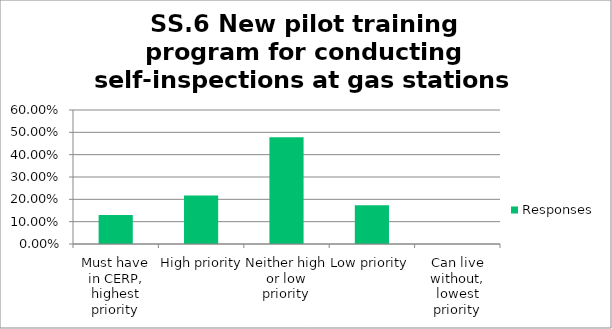
| Category | Responses |
|---|---|
| Must have in CERP, highest priority | 0.13 |
| High priority | 0.217 |
| Neither high or low priority | 0.478 |
| Low priority | 0.174 |
| Can live without, lowest priority | 0 |